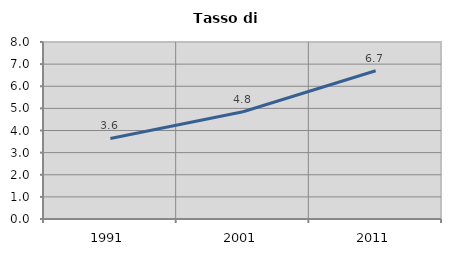
| Category | Tasso di disoccupazione   |
|---|---|
| 1991.0 | 3.641 |
| 2001.0 | 4.847 |
| 2011.0 | 6.7 |